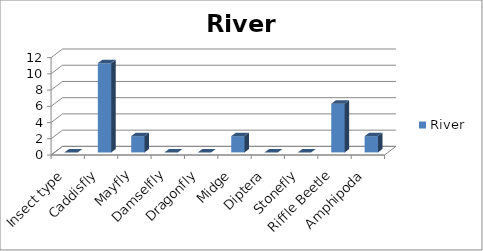
| Category | River |
|---|---|
| Insect type | 0 |
| Caddisfly | 11 |
| Mayfly | 2 |
| Damselfly | 0 |
| Dragonfly | 0 |
| Midge | 2 |
| Diptera | 0 |
| Stonefly | 0 |
| Riffle Beetle | 6 |
| Amphipoda | 2 |